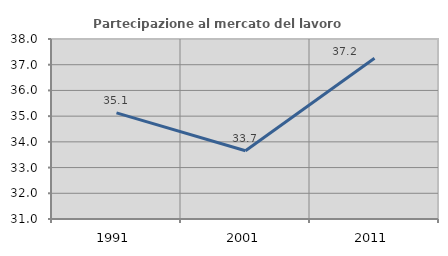
| Category | Partecipazione al mercato del lavoro  femminile |
|---|---|
| 1991.0 | 35.128 |
| 2001.0 | 33.655 |
| 2011.0 | 37.248 |